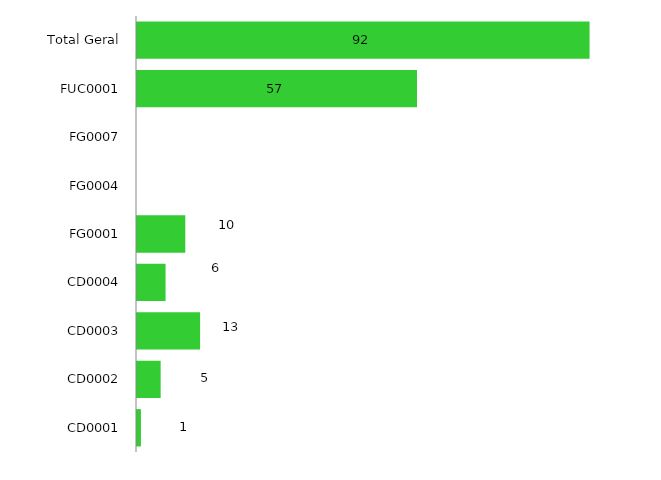
| Category | 2019 |
|---|---|
| CD0001 | 1 |
| CD0002 | 5 |
| CD0003 | 13 |
| CD0004 | 6 |
| FG0001 | 10 |
| FG0004 | 0 |
| FG0007 | 0 |
| FUC0001 | 57 |
| Total Geral | 92 |